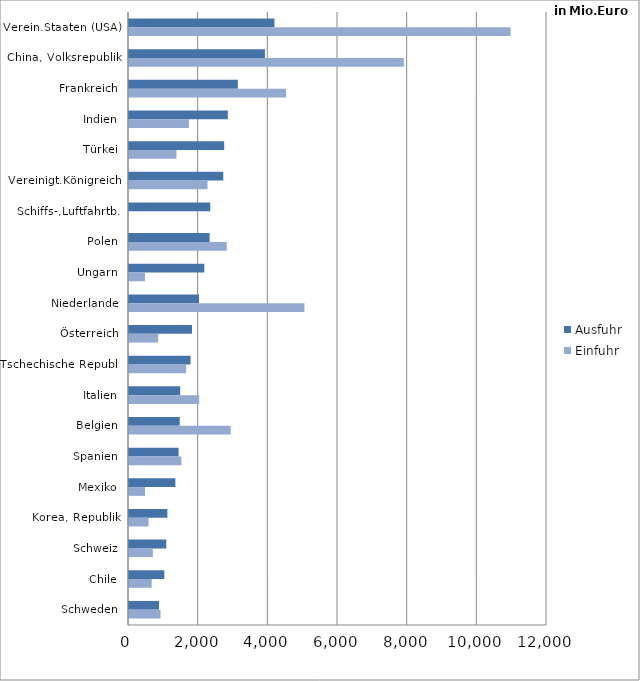
| Category | Ausfuhr | Einfuhr |
|---|---|---|
| Verein.Staaten (USA) | 4176.727 | 10955.426 |
| China, Volksrepublik | 3903.035 | 7891.605 |
| Frankreich | 3125.11 | 4510.29 |
| Indien | 2838.088 | 1719.052 |
| Türkei | 2732.707 | 1361.516 |
| Vereinigt.Königreich | 2705.831 | 2255.305 |
| Schiffs-,Luftfahrtb. | 2332.022 | 0 |
| Polen | 2314.378 | 2807.956 |
| Ungarn | 2162.666 | 457.828 |
| Niederlande | 2008.688 | 5036.218 |
| Österreich | 1808.972 | 837.806 |
| Tschechische Republ. | 1767.288 | 1638.208 |
| Italien | 1469.841 | 2014.331 |
| Belgien | 1455.706 | 2919.477 |
| Spanien | 1423.083 | 1503.564 |
| Mexiko | 1331.032 | 462.033 |
| Korea, Republik | 1102.606 | 561.666 |
| Schweiz | 1069.49 | 684.487 |
| Chile | 1014.059 | 650.854 |
| Schweden | 862.094 | 905.663 |